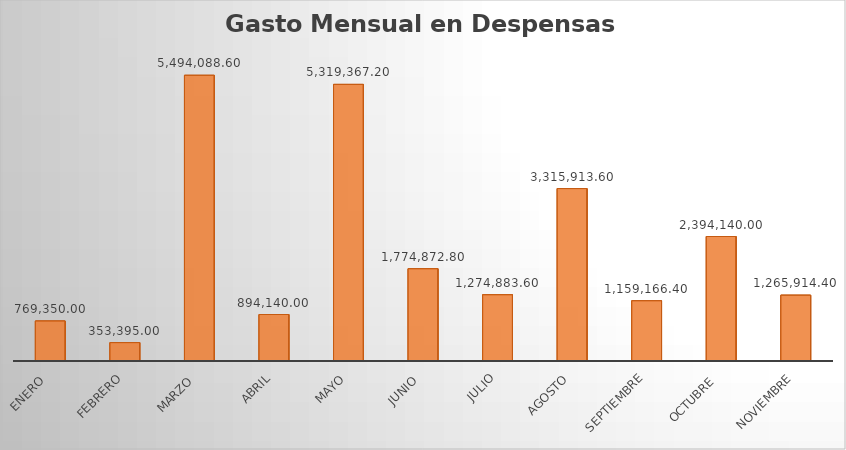
| Category | Monto |
|---|---|
| Enero  | 769350 |
| Febrero | 353395 |
| Marzo  | 5494088.6 |
| Abril | 894140 |
| Mayo | 5319367.2 |
| Junio  | 1774872.8 |
| Julio | 1274883.6 |
| Agosto | 3315913.6 |
| Septiembre | 1159166.4 |
| Octubre  | 2394140 |
| Noviembre | 1265914.4 |